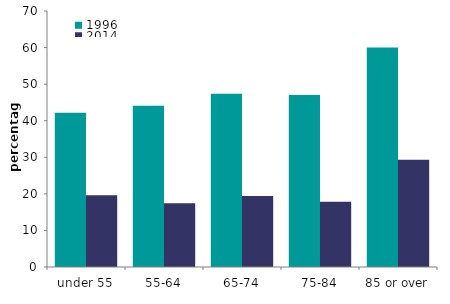
| Category | 1996 | 2014 |
|---|---|---|
| under 55 | 42.207 | 19.604 |
| 55-64 | 44.108 | 17.413 |
| 65-74 | 47.361 | 19.438 |
| 75-84 | 47.016 | 17.875 |
| 85 or over | 60.04 | 29.342 |